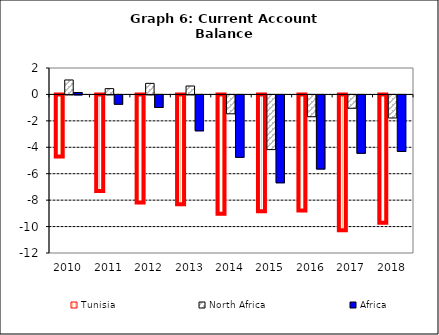
| Category | Tunisia | North Africa | Africa |
|---|---|---|---|
| 2010.0 | -4.777 | 1.095 | 0.144 |
| 2011.0 | -7.391 | 0.439 | -0.706 |
| 2012.0 | -8.262 | 0.839 | -0.95 |
| 2013.0 | -8.386 | 0.638 | -2.715 |
| 2014.0 | -9.113 | -1.429 | -4.722 |
| 2015.0 | -8.921 | -4.138 | -6.65 |
| 2016.0 | -8.857 | -1.65 | -5.608 |
| 2017.0 | -10.355 | -1.011 | -4.418 |
| 2018.0 | -9.785 | -1.744 | -4.278 |